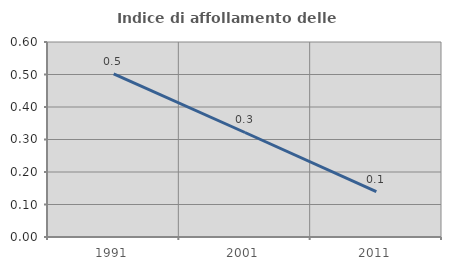
| Category | Indice di affollamento delle abitazioni  |
|---|---|
| 1991.0 | 0.502 |
| 2001.0 | 0.322 |
| 2011.0 | 0.14 |